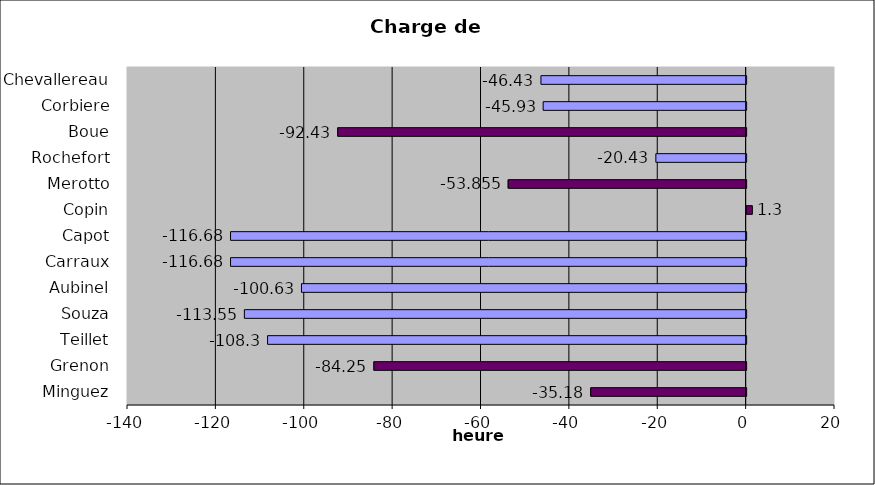
| Category | Series 0 |
|---|---|
| Minguez | -35.18 |
| Grenon | -84.25 |
| Teillet | -108.3 |
| Souza | -113.55 |
| Aubinel | -100.63 |
| Carraux | -116.68 |
| Capot | -116.68 |
| Copin | 1.3 |
| Merotto | -53.855 |
| Rochefort | -20.43 |
| Boue | -92.43 |
| Corbiere | -45.93 |
| Chevallereau | -46.43 |